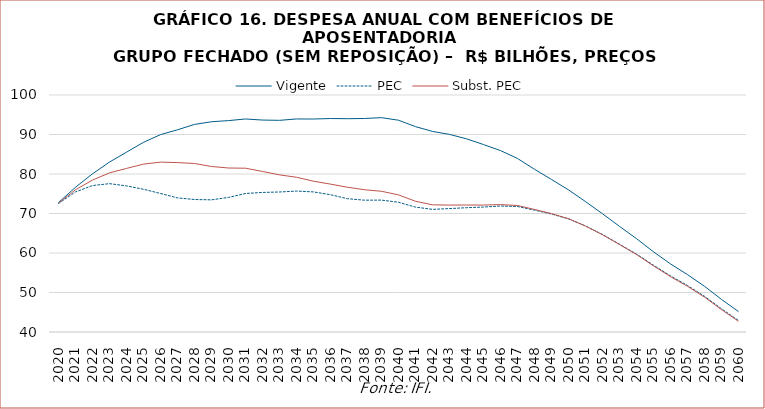
| Category | Vigente | PEC | Subst. PEC |
|---|---|---|---|
| 2020.0 | 72774756124.932 | 72524253313.079 | 72631821251.272 |
| 2021.0 | 76637804465.118 | 75463946623.48 | 76008445500.518 |
| 2022.0 | 80054197088.348 | 77076812773.734 | 78468480236.078 |
| 2023.0 | 83025162670.551 | 77554216958.135 | 80278560045.693 |
| 2024.0 | 85521231360.678 | 76988846370.48 | 81415837510.966 |
| 2025.0 | 88019587520.99 | 76135179284.941 | 82504142453.861 |
| 2026.0 | 89966170951.242 | 75071663781.726 | 83006163637.878 |
| 2027.0 | 91192013103.88 | 73957365954.713 | 82890959656.084 |
| 2028.0 | 92552947571.269 | 73543874632.026 | 82663457941.698 |
| 2029.0 | 93230903764.766 | 73458599480.981 | 81902110713.283 |
| 2030.0 | 93519481775.051 | 74068625100.779 | 81515912489.09 |
| 2031.0 | 93929117079.628 | 75065090762.856 | 81465582544.236 |
| 2032.0 | 93657376274.962 | 75332039726.11 | 80634101899.199 |
| 2033.0 | 93586339338.649 | 75444383855.938 | 79780371896.101 |
| 2034.0 | 93935785383.615 | 75675450501.347 | 79176537963.136 |
| 2035.0 | 93916788768.991 | 75466601662.036 | 78173871444.158 |
| 2036.0 | 94046432471.349 | 74754696683.198 | 77433836408.181 |
| 2037.0 | 94000777197.826 | 73747625901.392 | 76646651437.65 |
| 2038.0 | 94052171042.881 | 73369865806.933 | 76010016249.9 |
| 2039.0 | 94260309979.334 | 73390869448.976 | 75626310808.347 |
| 2040.0 | 93617981179.436 | 72846646225.228 | 74707706595.823 |
| 2041.0 | 91993594908.022 | 71615849509.348 | 73099085645.851 |
| 2042.0 | 90780194529.537 | 71046812585.027 | 72192611442.481 |
| 2043.0 | 90030318537.442 | 71244874548.964 | 72128277255.836 |
| 2044.0 | 88904566979.672 | 71465593638.526 | 72149072783.859 |
| 2045.0 | 87455971093.69 | 71635462106.676 | 72139051298.773 |
| 2046.0 | 85929564738.119 | 71895037023.194 | 72260770951.992 |
| 2047.0 | 83929073616.459 | 71773551568.228 | 72025372777.72 |
| 2048.0 | 81192037214.222 | 70845903879.773 | 71025843469.184 |
| 2049.0 | 78614959978.686 | 69868553389.543 | 69974620207.896 |
| 2050.0 | 75977335035.919 | 68652972274.42 | 68681253635.957 |
| 2051.0 | 73013827030.616 | 66848562429.948 | 66805610583.173 |
| 2052.0 | 69934125015.993 | 64692702806.857 | 64615685558.337 |
| 2053.0 | 66742002705.746 | 62221451089.876 | 62148669066.389 |
| 2054.0 | 63634848262.548 | 59731013112.294 | 59609592929.371 |
| 2055.0 | 60300844835.212 | 56904844410.568 | 56732791825.317 |
| 2056.0 | 57238706948.194 | 54214472670.89 | 54018340247.283 |
| 2057.0 | 54519032144.85 | 51774517302.362 | 51565214114.862 |
| 2058.0 | 51575607295.537 | 49038754869.488 | 48826501460.045 |
| 2059.0 | 48249735273.43 | 45879005508.679 | 45668007636.085 |
| 2060.0 | 45163354217.476 | 42920987101.227 | 42708937089.13 |